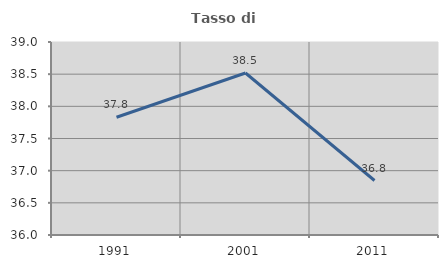
| Category | Tasso di occupazione   |
|---|---|
| 1991.0 | 37.83 |
| 2001.0 | 38.519 |
| 2011.0 | 36.847 |